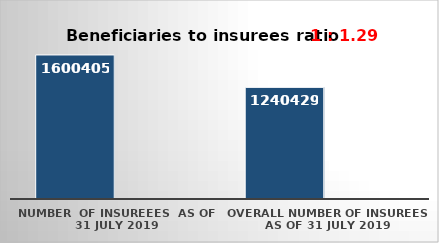
| Category | Series 0 | Series 1 |
|---|---|---|
| NUMBER  of insureees  as of  31 July 2019 | 1600405 |  |
| OVERALL number of insurees as of 31 July 2019 | 1240429 |  |